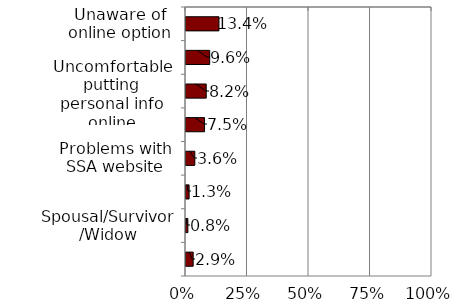
| Category | Series 0 |
|---|---|
| Unaware of online option | 0.134 |
| Prefer in-person | 0.096 |
| Uncomfortable putting personal info online | 0.082 |
| Uncomfortable with Internet/computers | 0.075 |
| Problems with SSA website | 0.036 |
| Incorrect personal data | 0.013 |
| Spousal/Survivor/Widow | 0.008 |
| Other | 0.029 |